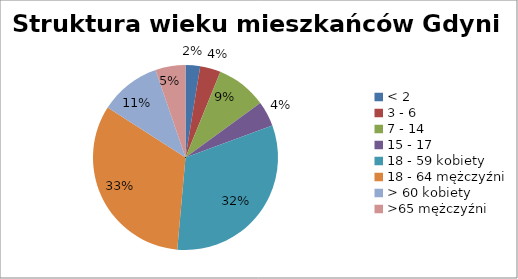
| Category | Series 0 | Series 1 |
|---|---|---|
| < 2 | 6512 | 0.025 |
| 3 - 6 | 9203 | 0.036 |
| 7 - 14 | 22546 | 0.088 |
| 15 - 17 | 11276 | 0.044 |
| 18 - 59 kobiety | 81801 | 0.32 |
| 18 - 64 mężczyźni | 83410 | 0.327 |
| > 60 kobiety | 27246 | 0.107 |
| >65 mężczyźni | 13399 | 0.052 |